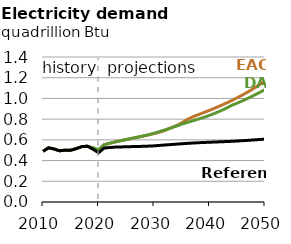
| Category | EAC | DAC | Reference |
|---|---|---|---|
| 2010.0 | 0.49 | 0.49 | 0.49 |
| 2011.0 | 0.523 | 0.523 | 0.523 |
| 2012.0 | 0.512 | 0.512 | 0.512 |
| 2013.0 | 0.494 | 0.494 | 0.494 |
| 2014.0 | 0.501 | 0.501 | 0.501 |
| 2015.0 | 0.5 | 0.5 | 0.5 |
| 2016.0 | 0.516 | 0.516 | 0.516 |
| 2017.0 | 0.535 | 0.535 | 0.535 |
| 2018.0 | 0.538 | 0.538 | 0.538 |
| 2019.0 | 0.524 | 0.524 | 0.51 |
| 2020.0 | 0.504 | 0.504 | 0.476 |
| 2021.0 | 0.553 | 0.553 | 0.521 |
| 2022.0 | 0.567 | 0.567 | 0.526 |
| 2023.0 | 0.58 | 0.58 | 0.53 |
| 2024.0 | 0.592 | 0.592 | 0.532 |
| 2025.0 | 0.603 | 0.603 | 0.533 |
| 2026.0 | 0.614 | 0.615 | 0.535 |
| 2027.0 | 0.625 | 0.626 | 0.536 |
| 2028.0 | 0.636 | 0.637 | 0.538 |
| 2029.0 | 0.648 | 0.649 | 0.54 |
| 2030.0 | 0.66 | 0.664 | 0.542 |
| 2031.0 | 0.675 | 0.68 | 0.546 |
| 2032.0 | 0.691 | 0.697 | 0.55 |
| 2033.0 | 0.715 | 0.714 | 0.554 |
| 2034.0 | 0.737 | 0.732 | 0.559 |
| 2035.0 | 0.764 | 0.752 | 0.563 |
| 2036.0 | 0.797 | 0.768 | 0.566 |
| 2037.0 | 0.823 | 0.784 | 0.569 |
| 2038.0 | 0.843 | 0.801 | 0.572 |
| 2039.0 | 0.864 | 0.817 | 0.575 |
| 2040.0 | 0.885 | 0.837 | 0.577 |
| 2041.0 | 0.907 | 0.857 | 0.579 |
| 2042.0 | 0.93 | 0.88 | 0.581 |
| 2043.0 | 0.954 | 0.905 | 0.584 |
| 2044.0 | 0.98 | 0.933 | 0.586 |
| 2045.0 | 1.007 | 0.955 | 0.589 |
| 2046.0 | 1.035 | 0.979 | 0.592 |
| 2047.0 | 1.065 | 1.003 | 0.596 |
| 2048.0 | 1.098 | 1.029 | 0.599 |
| 2049.0 | 1.132 | 1.057 | 0.603 |
| 2050.0 | 1.167 | 1.085 | 0.607 |